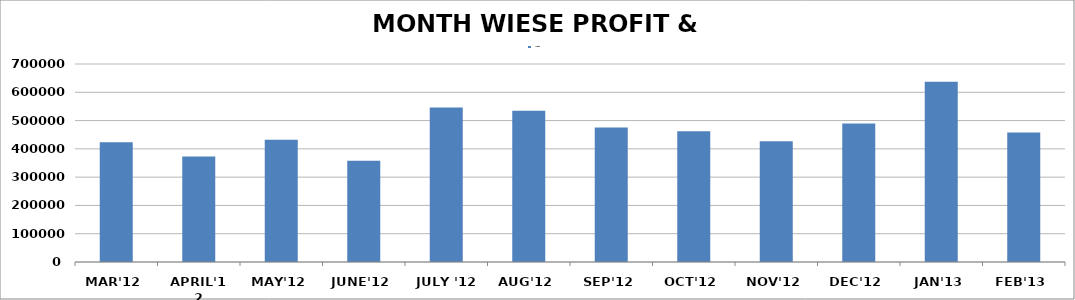
| Category | PROFIT |
|---|---|
| MAR'12 | 423762 |
| APRIL'12 | 373212 |
| MAY'12 | 432494 |
| JUNE'12 | 357544 |
| JULY '12 | 545800 |
| AUG'12 | 534896 |
| SEP'12 | 475606 |
| OCT'12 | 461975 |
| NOV'12 | 427300 |
| DEC'12 | 489531 |
| JAN'13 | 637131 |
| FEB'13 | 458068 |